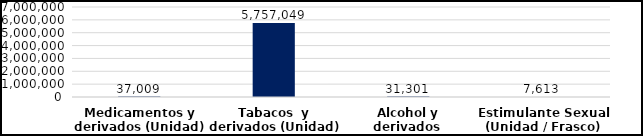
| Category | Series 0 |
|---|---|
| Medicamentos y derivados (Unidad) | 37009 |
| Tabacos  y derivados (Unidad) | 5757049 |
| Alcohol y derivados  (Botellas) | 31301 |
| Estimulante Sexual (Unidad / Frasco) | 7613 |